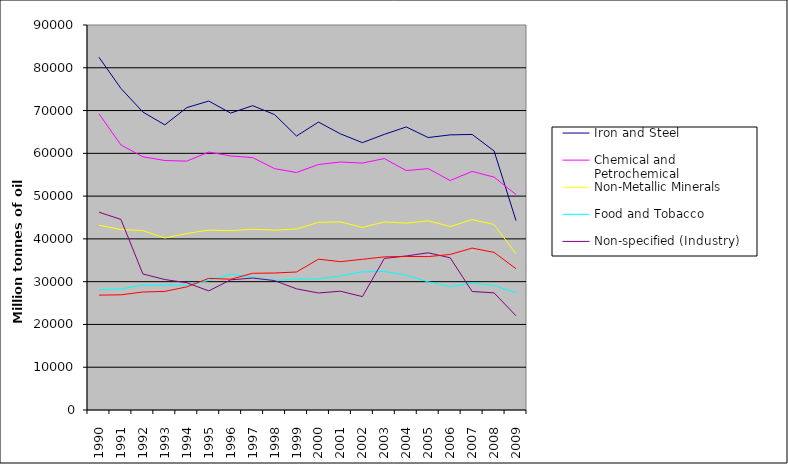
| Category | Iron and Steel | Chemical and Petrochemical | Non-Metallic Minerals | Food and Tobacco | Non-specified (Industry) | Paper, Pulp and Print |
|---|---|---|---|---|---|---|
| 1990.0 | 82459 | 69239 | 43183 | 28103 | 46248 | 26854 |
| 1991.0 | 75167 | 61959 | 42199 | 28299 | 44550 | 26925 |
| 1992.0 | 69657 | 59192 | 41948 | 29176 | 31798 | 27582 |
| 1993.0 | 66652 | 58324 | 40207 | 29185 | 30493 | 27726 |
| 1994.0 | 70686 | 58179 | 41243 | 29158 | 29752 | 28782 |
| 1995.0 | 72220 | 60295 | 42068 | 30287 | 27842 | 30775 |
| 1996.0 | 69407 | 59391 | 41922 | 31774 | 30434 | 30567 |
| 1997.0 | 71144 | 59003 | 42262 | 31007 | 30844 | 31958 |
| 1998.0 | 69059 | 56419 | 42042 | 30317 | 30247 | 32021 |
| 1999.0 | 64042 | 55518 | 42314 | 30576 | 28325 | 32261 |
| 2000.0 | 67307 | 57386 | 43876 | 30643 | 27351 | 35254 |
| 2001.0 | 64556 | 57965 | 43977 | 31350 | 27768 | 34680 |
| 2002.0 | 62498 | 57724 | 42669 | 32305 | 26506 | 35228 |
| 2003.0 | 64436 | 58774 | 43971 | 32387 | 35427 | 35801 |
| 2004.0 | 66164 | 55973 | 43681 | 31511 | 36013 | 35897 |
| 2005.0 | 63687 | 56428 | 44245 | 29960 | 36751 | 35854 |
| 2006.0 | 64316 | 53643 | 42872 | 28861 | 35576 | 36359 |
| 2007.0 | 64416 | 55772 | 44510 | 29640 | 27703 | 37845 |
| 2008.0 | 60557 | 54443 | 43367 | 29075 | 27382 | 36846 |
| 2009.0 | 44269 | 50378 | 36529 | 27439 | 22015 | 33028 |